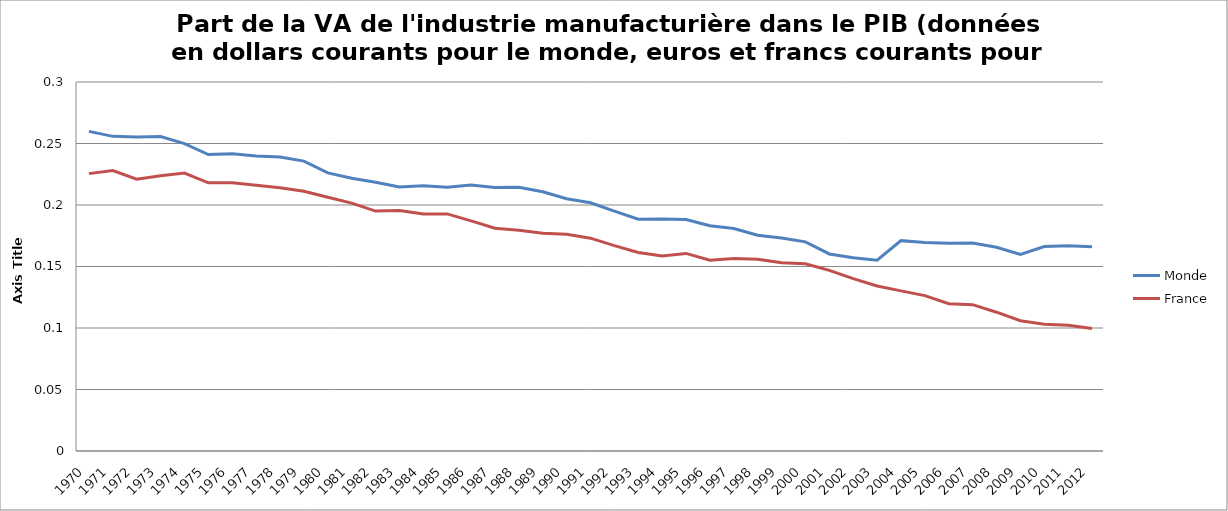
| Category | Monde | France |
|---|---|---|
| 1970.0 | 0.26 | 0.226 |
| 1971.0 | 0.256 | 0.228 |
| 1972.0 | 0.255 | 0.221 |
| 1973.0 | 0.256 | 0.224 |
| 1974.0 | 0.25 | 0.226 |
| 1975.0 | 0.241 | 0.218 |
| 1976.0 | 0.242 | 0.218 |
| 1977.0 | 0.24 | 0.216 |
| 1978.0 | 0.239 | 0.214 |
| 1979.0 | 0.236 | 0.211 |
| 1980.0 | 0.226 | 0.206 |
| 1981.0 | 0.222 | 0.202 |
| 1982.0 | 0.219 | 0.195 |
| 1983.0 | 0.215 | 0.196 |
| 1984.0 | 0.216 | 0.193 |
| 1985.0 | 0.214 | 0.193 |
| 1986.0 | 0.216 | 0.187 |
| 1987.0 | 0.214 | 0.181 |
| 1988.0 | 0.214 | 0.179 |
| 1989.0 | 0.211 | 0.177 |
| 1990.0 | 0.205 | 0.176 |
| 1991.0 | 0.202 | 0.173 |
| 1992.0 | 0.195 | 0.167 |
| 1993.0 | 0.188 | 0.161 |
| 1994.0 | 0.189 | 0.158 |
| 1995.0 | 0.188 | 0.161 |
| 1996.0 | 0.183 | 0.155 |
| 1997.0 | 0.181 | 0.156 |
| 1998.0 | 0.175 | 0.156 |
| 1999.0 | 0.173 | 0.153 |
| 2000.0 | 0.17 | 0.152 |
| 2001.0 | 0.16 | 0.147 |
| 2002.0 | 0.157 | 0.14 |
| 2003.0 | 0.155 | 0.134 |
| 2004.0 | 0.171 | 0.13 |
| 2005.0 | 0.17 | 0.126 |
| 2006.0 | 0.169 | 0.12 |
| 2007.0 | 0.169 | 0.119 |
| 2008.0 | 0.166 | 0.113 |
| 2009.0 | 0.16 | 0.106 |
| 2010.0 | 0.166 | 0.103 |
| 2011.0 | 0.167 | 0.102 |
| 2012.0 | 0.166 | 0.1 |